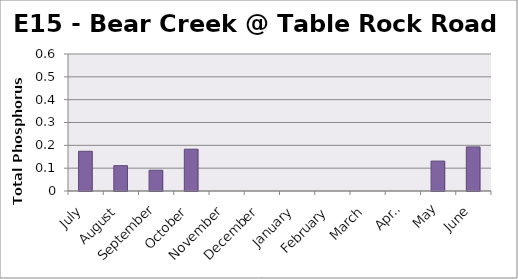
| Category | Phosphorus (mg/L) |
|---|---|
| July | 0.174 |
| August | 0.111 |
| September | 0.091 |
| October | 0.183 |
| November | 0 |
| December | 0 |
| January | 0 |
| February | 0 |
| March | 0 |
| April | 0 |
| May | 0.131 |
| June | 0.193 |